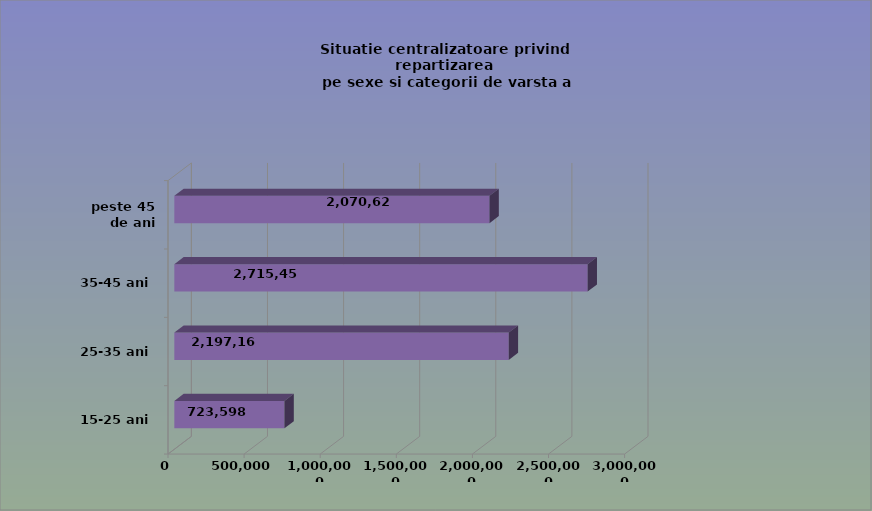
| Category | 15-25 ani 25-35 ani 35-45 ani peste 45 de ani |
|---|---|
| 15-25 ani | 723598 |
| 25-35 ani | 2197165 |
| 35-45 ani | 2715451 |
| peste 45 de ani | 2070621 |